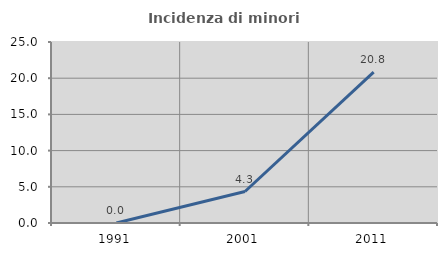
| Category | Incidenza di minori stranieri |
|---|---|
| 1991.0 | 0 |
| 2001.0 | 4.348 |
| 2011.0 | 20.833 |